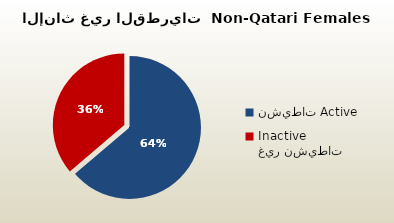
| Category | الاناث غير القطريات  Non-Qatari Females |
|---|---|
| نشيطات Active | 244841 |
| غير نشيطات Inactive | 138963 |